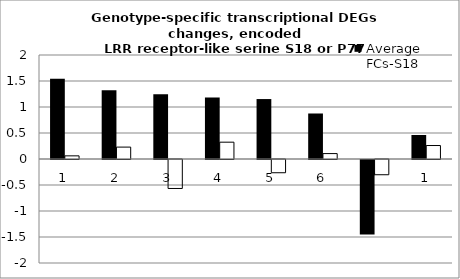
| Category | Average FCs-S18 | Average FCs-P77 |
|---|---|---|
| 1.0 | 1.543 | 0.06 |
| 2.0 | 1.324 | 0.229 |
| 3.0 | 1.244 | -0.557 |
| 4.0 | 1.183 | 0.324 |
| 5.0 | 1.153 | -0.255 |
| 6.0 | 0.875 | 0.104 |
| 7.0 | -1.432 | -0.293 |
| 1.0 | 0.461 | 0.259 |